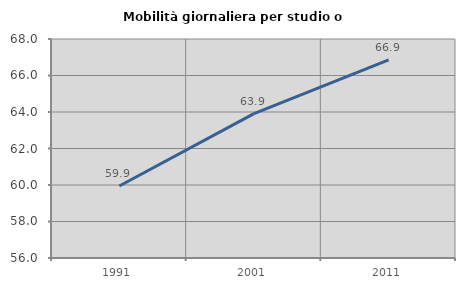
| Category | Mobilità giornaliera per studio o lavoro |
|---|---|
| 1991.0 | 59.944 |
| 2001.0 | 63.909 |
| 2011.0 | 66.856 |